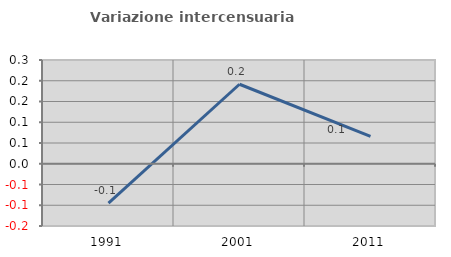
| Category | Variazione intercensuaria annua |
|---|---|
| 1991.0 | -0.095 |
| 2001.0 | 0.192 |
| 2011.0 | 0.066 |